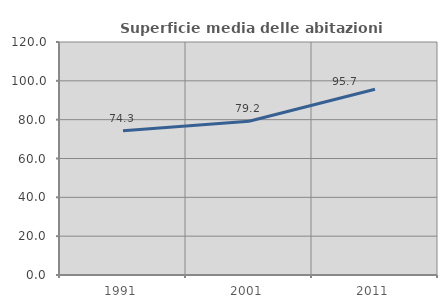
| Category | Superficie media delle abitazioni occupate |
|---|---|
| 1991.0 | 74.279 |
| 2001.0 | 79.209 |
| 2011.0 | 95.685 |